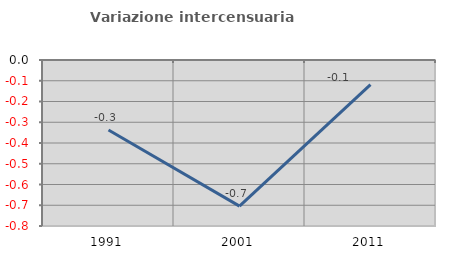
| Category | Variazione intercensuaria annua |
|---|---|
| 1991.0 | -0.337 |
| 2001.0 | -0.704 |
| 2011.0 | -0.118 |